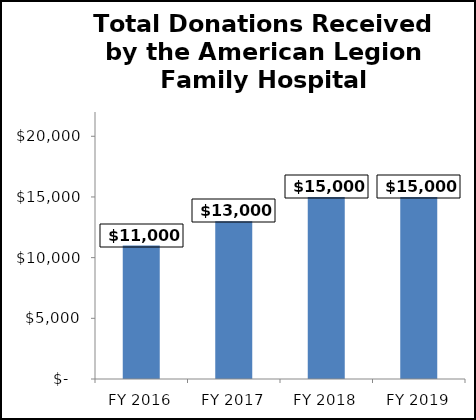
| Category | Series 0 |
|---|---|
| FY 2016 | 11000 |
| FY 2017 | 13000 |
| FY 2018 | 15000 |
| FY 2019 | 15000 |